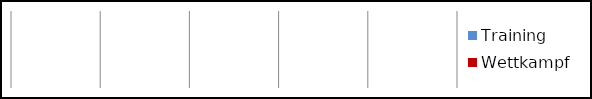
| Category | Training | Wettkampf |
|---|---|---|
| 0 | 0 | 0 |